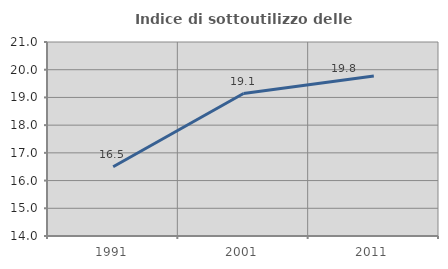
| Category | Indice di sottoutilizzo delle abitazioni  |
|---|---|
| 1991.0 | 16.5 |
| 2001.0 | 19.141 |
| 2011.0 | 19.776 |